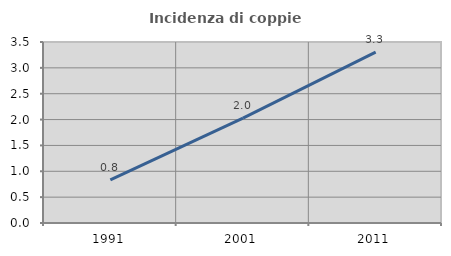
| Category | Incidenza di coppie miste |
|---|---|
| 1991.0 | 0.834 |
| 2001.0 | 2.03 |
| 2011.0 | 3.303 |